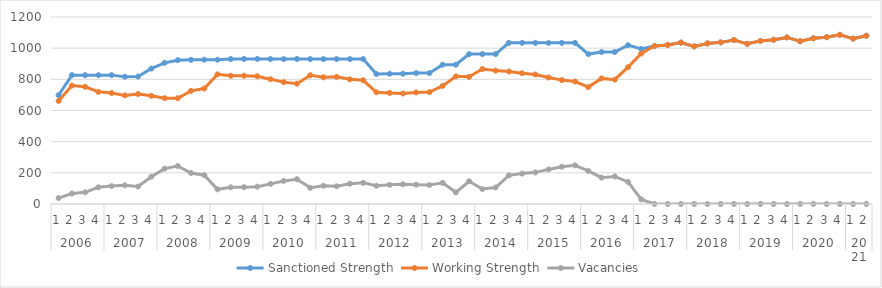
| Category | Sanctioned Strength | Working Strength | Vacancies |
|---|---|---|---|
| 0 | 699 | 661 | 38 |
| 1 | 827 | 760 | 67 |
| 2 | 827 | 752 | 75 |
| 3 | 827 | 720 | 107 |
| 4 | 827 | 712 | 115 |
| 5 | 817 | 697 | 120 |
| 6 | 818 | 706 | 112 |
| 7 | 869 | 694 | 175 |
| 8 | 906 | 679 | 227 |
| 9 | 923 | 679 | 244 |
| 10 | 925 | 726 | 199 |
| 11 | 926 | 741 | 185 |
| 12 | 926 | 832 | 94 |
| 13 | 930 | 823 | 107 |
| 14 | 931 | 823 | 108 |
| 15 | 931 | 820 | 111 |
| 16 | 930 | 801 | 129 |
| 17 | 930 | 782 | 148 |
| 18 | 931 | 772 | 159 |
| 19 | 930 | 826 | 104 |
| 20 | 930 | 813 | 117 |
| 21 | 930 | 816 | 114 |
| 22 | 930 | 800 | 130 |
| 23 | 930 | 794 | 136 |
| 24 | 834 | 717 | 117 |
| 25 | 836 | 713 | 123 |
| 26 | 836 | 709 | 127 |
| 27 | 840 | 716 | 124 |
| 28 | 840 | 718 | 122 |
| 29 | 894 | 758 | 136 |
| 30 | 894 | 819 | 75 |
| 31 | 962 | 816 | 146 |
| 32 | 962 | 866 | 96 |
| 33 | 962 | 856 | 106 |
| 34 | 1034 | 850 | 184 |
| 35 | 1034 | 839 | 195 |
| 36 | 1034 | 831 | 203 |
| 37 | 1034 | 812 | 222 |
| 38 | 1034 | 795 | 239 |
| 39 | 1034 | 786 | 248 |
| 40 | 962 | 750 | 212 |
| 41 | 975 | 806 | 169 |
| 42 | 975 | 798 | 177 |
| 43 | 1019.32 | 877.8 | 141.52 |
| 44 | 994.749 | 965.58 | 29.169 |
| 45 | 1013.658 | 1013.658 | 0 |
| 46 | 1020.658 | 1020.658 | 0 |
| 47 | 1035.869 | 1035.869 | 0 |
| 48 | 1011.298 | 1011.298 | 0 |
| 49 | 1030.207 | 1030.207 | 0 |
| 50 | 1037.207 | 1037.207 | 0 |
| 51 | 1052.418 | 1052.418 | 0 |
| 52 | 1027.847 | 1027.847 | 0 |
| 53 | 1046.756 | 1046.756 | 0 |
| 54 | 1053.756 | 1053.756 | 0 |
| 55 | 1068.967 | 1068.967 | 0 |
| 56 | 1044.396 | 1044.396 | 0 |
| 57 | 1063.305 | 1063.305 | 0 |
| 58 | 1070.305 | 1070.305 | 0 |
| 59 | 1085.516 | 1085.516 | 0 |
| 60 | 1060.945 | 1060.945 | 0 |
| 61 | 1079.855 | 1079.855 | 0 |